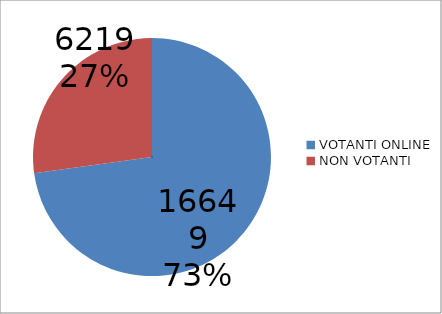
| Category | Series 0 |
|---|---|
| VOTANTI ONLINE | 16649 |
| NON VOTANTI | 6219 |